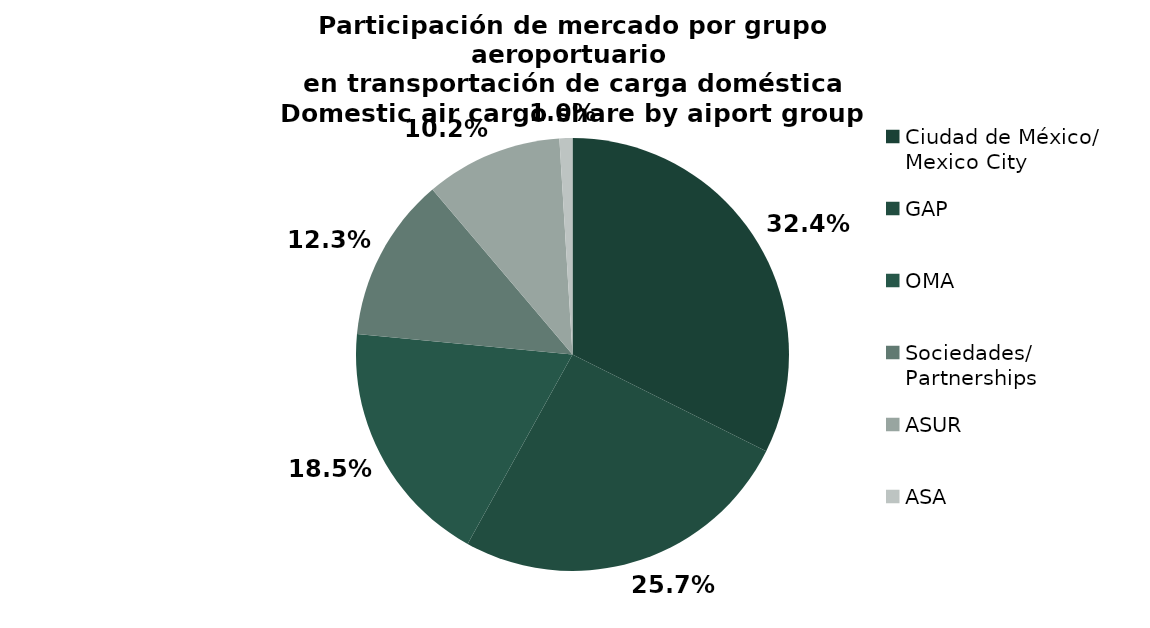
| Category | Series 0 |
|---|---|
| Ciudad de México/
Mexico City | 9371.84 |
| GAP | 7433.211 |
| OMA | 5345.927 |
| Sociedades/
Partnerships | 3558.05 |
| ASUR | 2961.048 |
| ASA | 279.969 |